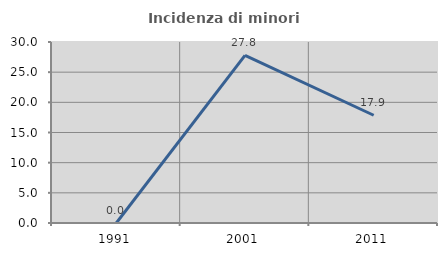
| Category | Incidenza di minori stranieri |
|---|---|
| 1991.0 | 0 |
| 2001.0 | 27.778 |
| 2011.0 | 17.857 |